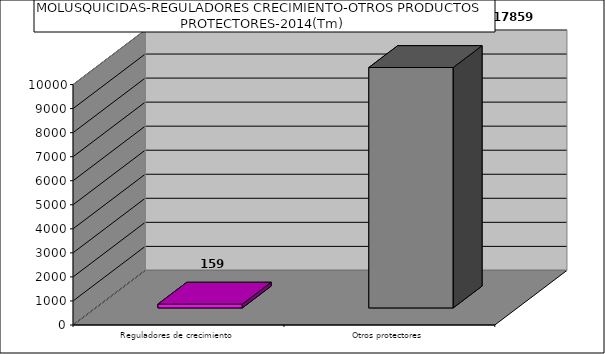
| Category | Reguladores de crecimiento Otros protectores |
|---|---|
| Reguladores de crecimiento | 159 |
| Otros protectores | 17859 |